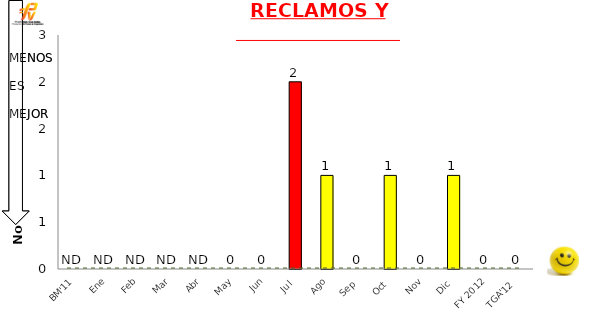
| Category | Mensual |
|---|---|
| BM'11 | 0 |
| Ene | 0 |
| Feb | 0 |
| Mar | 0 |
| Abr | 0 |
| May | 0 |
| Jun | 0 |
| Jul | 2 |
| Ago | 1 |
| Sep | 0 |
| Oct | 1 |
| Nov | 0 |
| Dic | 1 |
| FY 2012 | 0 |
| TGA'12 | 0 |